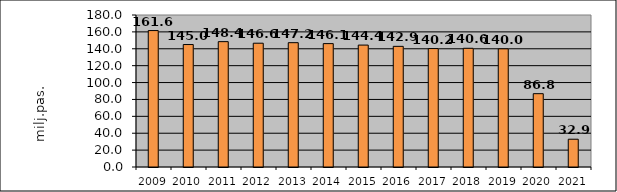
| Category | Series 1 |
|---|---|
| 2009.0 | 161.559 |
| 2010.0 | 145.021 |
| 2011.0 | 148.448 |
| 2012.0 | 146.587 |
| 2013.0 | 147.216 |
| 2014.0 | 146.114 |
| 2015.0 | 144.374 |
| 2016.0 | 142.871 |
| 2017.0 | 140.249 |
| 2018.0 | 140.583 |
| 2019.0 | 139.955 |
| 2020.0 | 86.825 |
| 2021.0 | 32.891 |